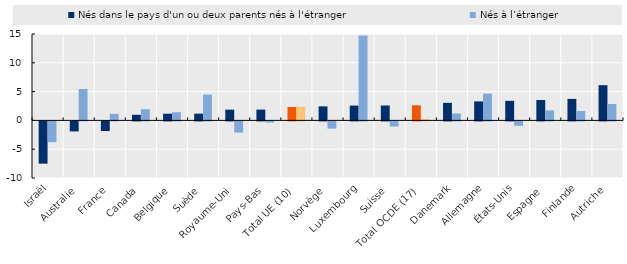
| Category | Nés dans le pays d'un ou deux parents nés à l'étranger | Nés à l’étranger |
|---|---|---|
| Israël | -7.335 | -3.605 |
| Australie | -1.738 | 5.446 |
| France | -1.676 | 1.139 |
| Canada | 0.978 | 1.942 |
| Belgique | 1.164 | 1.415 |
| Suède | 1.173 | 4.474 |
| Royaume-Uni | 1.864 | -1.937 |
| Pays-Bas | 1.874 | -0.2 |
| Total UE (10) | 2.33 | 2.385 |
| Norvège | 2.44 | -1.249 |
| Luxembourg | 2.569 | 14.729 |
| Suisse | 2.586 | -0.888 |
| Total OCDE (17) | 2.618 | 0.207 |
| Danemark | 3.05 | 1.204 |
| Allemagne | 3.297 | 4.645 |
| États-Unis | 3.394 | -0.762 |
| Espagne | 3.543 | 1.743 |
| Finlande | 3.732 | 1.625 |
| Autriche | 6.118 | 2.849 |